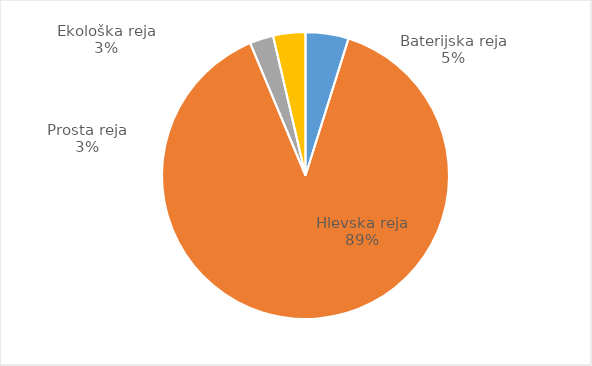
| Category | Količina kosov jajc |
|---|---|
| Baterijska reja | 136814 |
| Hlevska reja | 2508553 |
| Prosta reja | 75255 |
| Ekološka reja | 102660 |